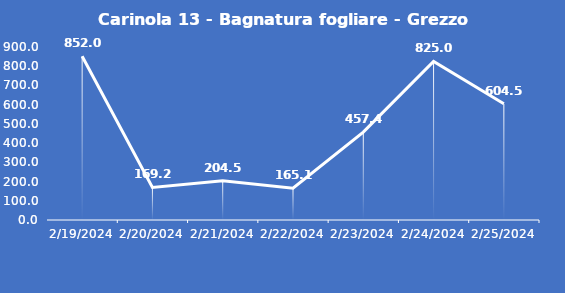
| Category | Carinola 13 - Bagnatura fogliare - Grezzo (min) |
|---|---|
| 2/19/24 | 852 |
| 2/20/24 | 169.2 |
| 2/21/24 | 204.5 |
| 2/22/24 | 165.1 |
| 2/23/24 | 457.4 |
| 2/24/24 | 825 |
| 2/25/24 | 604.5 |